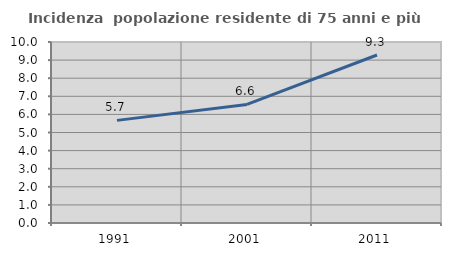
| Category | Incidenza  popolazione residente di 75 anni e più |
|---|---|
| 1991.0 | 5.67 |
| 2001.0 | 6.552 |
| 2011.0 | 9.282 |